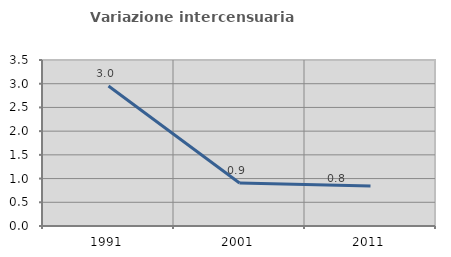
| Category | Variazione intercensuaria annua |
|---|---|
| 1991.0 | 2.952 |
| 2001.0 | 0.906 |
| 2011.0 | 0.844 |